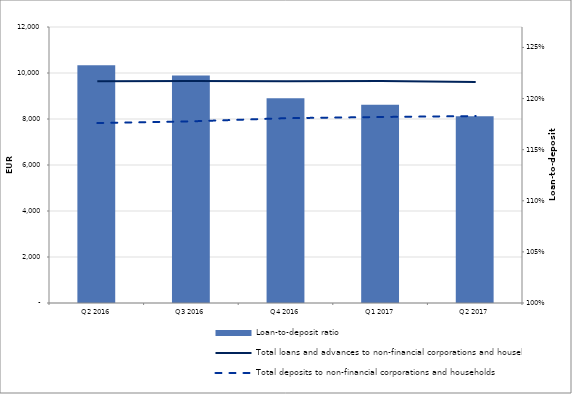
| Category | Loan-to-deposit ratio |
|---|---|
| Q2 2016 | 1.233 |
| Q3 2016 | 1.222 |
| Q4 2016 | 1.2 |
| Q1 2017 | 1.194 |
| Q2 2017 | 1.183 |